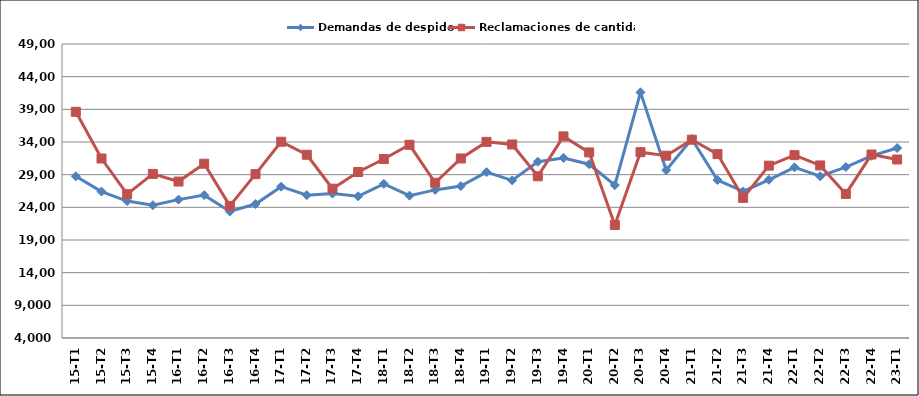
| Category | Demandas de despido | Reclamaciones de cantidad |
|---|---|---|
| 15-T1 | 28755 | 38621 |
| 15-T2 | 26417 | 31470 |
| 15-T3 | 24957 | 26018 |
| 15-T4 | 24328 | 29112 |
| 16-T1 | 25182 | 27945 |
| 16-T2 | 25866 | 30682 |
| 16-T3 | 23364 | 24220 |
| 16-T4 | 24509 | 29081 |
| 17-T1 | 27166 | 34041 |
| 17-T2 | 25869 | 32047 |
| 17-T3 | 26101 | 26854 |
| 17-T4 | 25688 | 29408 |
| 18-T1 | 27589 | 31392 |
| 18-T2 | 25785 | 33573 |
| 18-T3 | 26669 | 27761 |
| 18-T4 | 27251 | 31480 |
| 19-T1 | 29386 | 34020 |
| 19-T2 | 28121 | 33623 |
| 19-T3 | 30981 | 28752 |
| 19-T4 | 31561 | 34857 |
| 20-T1 | 30597 | 32408 |
| 20-T2 | 27401 | 21297 |
| 20-T3 | 41597 | 32446 |
| 20-T4 | 29692 | 31906 |
| 21-T1 | 34461 | 34356 |
| 21-T2 | 28179 | 32151 |
| 21-T3 | 26434 | 25447 |
| 21-T4 | 28219 | 30377 |
| 22-T1 | 30126 | 31990 |
| 22-T2 | 28753 | 30414 |
| 22-T3 | 30167 | 26050 |
| 22-T4 | 31889 | 32084 |
| 23-T1 | 33079 | 31323 |